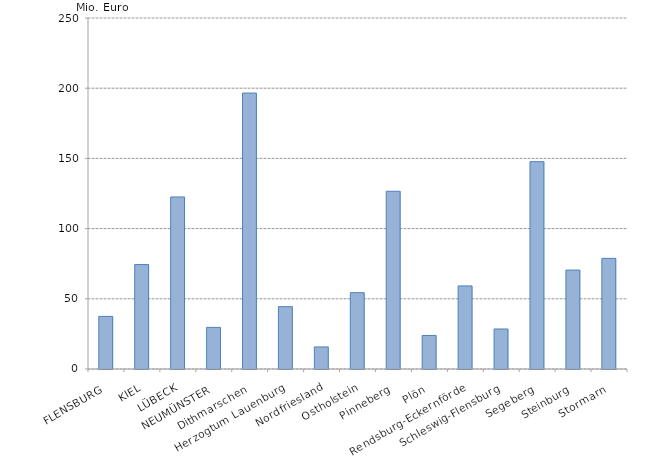
| Category | Series 0 |
|---|---|
| FLENSBURG | 37470.435 |
| KIEL | 74395.752 |
| LÜBECK | 122530.326 |
| NEUMÜNSTER | 29636.583 |
| Dithmarschen | 196542.717 |
| Herzogtum Lauenburg | 44411.971 |
| Nordfriesland | 15719.51 |
| Ostholstein | 54376.496 |
| Pinneberg | 126606.476 |
| Plön | 23888.151 |
| Rendsburg-Eckernförde | 59175.744 |
| Schleswig-Flensburg | 28505.292 |
| Segeberg | 147691.805 |
| Steinburg | 70460.553 |
| Stormarn | 78802.045 |